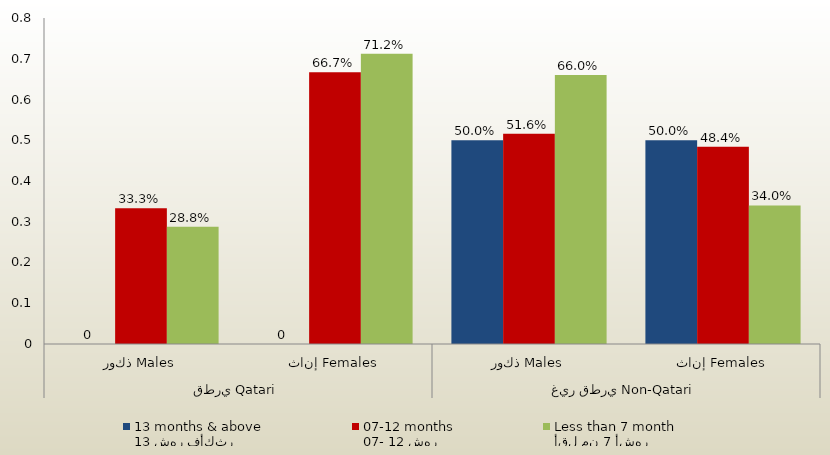
| Category | 13 شهر فأكثر
13 months & above | 07- 12 شهر
07-12 months | أقل من 7 أشهر
Less than 7 month  |
|---|---|---|---|
| 0 | 0 | 0.333 | 0.288 |
| 1 | 0 | 0.667 | 0.712 |
| 2 | 0.5 | 0.516 | 0.66 |
| 3 | 0.5 | 0.484 | 0.34 |